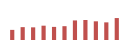
| Category | Importações (2) |
|---|---|
| 0 | 63256.661 |
| 1 | 80362.628 |
| 2 | 79098.748 |
| 3 | 89493.365 |
| 4 | 81914.569 |
| 5 | 86371.3 |
| 6 | 122399.001 |
| 7 | 125153.991 |
| 8 | 116754.909 |
| 9 | 110191 |
| 10 | 137123.28 |